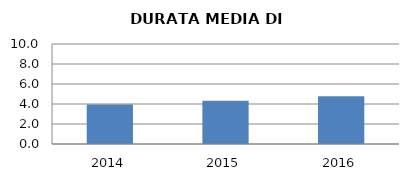
| Category | 2014 2015 2016 |
|---|---|
| 2014.0 | 3.962 |
| 2015.0 | 4.326 |
| 2016.0 | 4.767 |